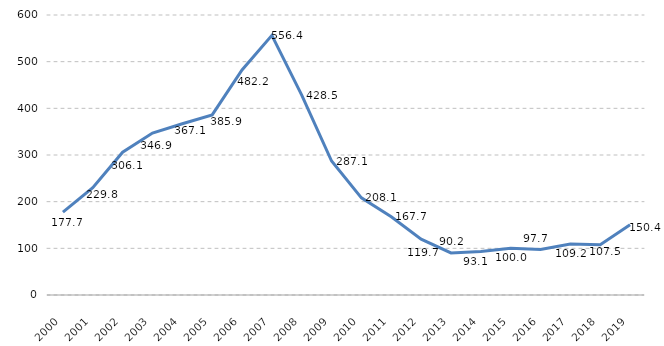
| Category | Series 0 |
|---|---|
| 2000.0 | 177.71 |
| 2001.0 | 229.752 |
| 2002.0 | 306.06 |
| 2003.0 | 346.928 |
| 2004.0 | 367.058 |
| 2005.0 | 385.935 |
| 2006.0 | 482.192 |
| 2007.0 | 556.43 |
| 2008.0 | 428.523 |
| 2009.0 | 287.12 |
| 2010.0 | 208.12 |
| 2011.0 | 167.672 |
| 2012.0 | 119.65 |
| 2013.0 | 90.218 |
| 2014.0 | 93.065 |
| 2015.0 | 100 |
| 2016.0 | 97.663 |
| 2017.0 | 109.22 |
| 2018.0 | 107.545 |
| 2019.0 | 150.405 |